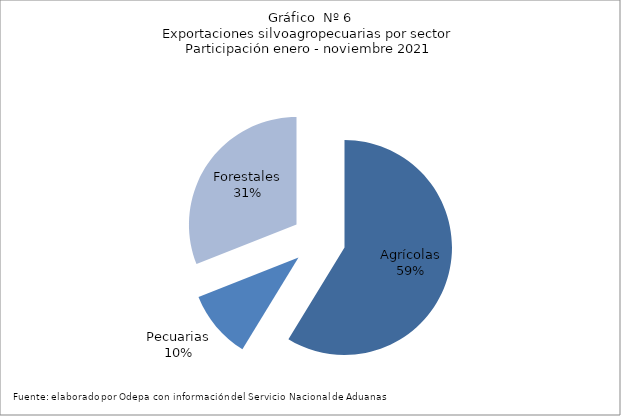
| Category | Series 0 |
|---|---|
| Agrícolas | 9227111 |
| Pecuarias | 1615070 |
| Forestales | 4867343 |